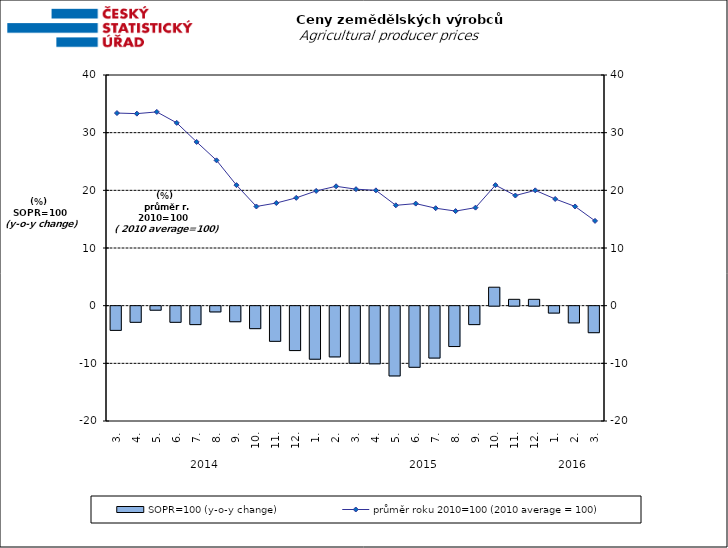
| Category | SOPR=100 (y-o-y change)   |
|---|---|
| 0 | -4.2 |
| 1 | -2.8 |
| 2 | -0.7 |
| 3 | -2.8 |
| 4 | -3.2 |
| 5 | -1 |
| 6 | -2.7 |
| 7 | -3.9 |
| 8 | -6.1 |
| 9 | -7.7 |
| 10 | -9.2 |
| 11 | -8.8 |
| 12 | -9.9 |
| 13 | -10 |
| 14 | -12.1 |
| 15 | -10.6 |
| 16 | -9 |
| 17 | -7 |
| 18 | -3.2 |
| 19 | 3.2 |
| 20 | 1.1 |
| 21 | 1.1 |
| 22 | -1.2 |
| 23 | -2.9 |
| 24 | -4.6 |